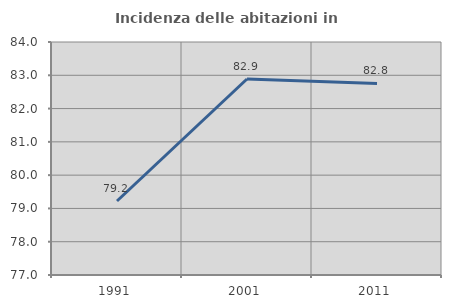
| Category | Incidenza delle abitazioni in proprietà  |
|---|---|
| 1991.0 | 79.223 |
| 2001.0 | 82.889 |
| 2011.0 | 82.754 |